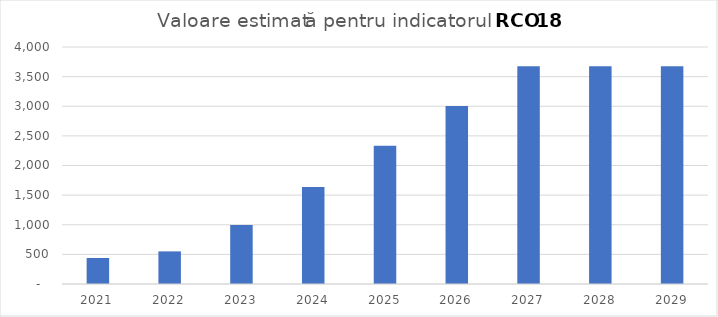
| Category | Series 0 |
|---|---|
| 2021.0 | 438.746 |
| 2022.0 | 550.292 |
| 2023.0 | 996.475 |
| 2024.0 | 1636.004 |
| 2025.0 | 2335.023 |
| 2026.0 | 3004.297 |
| 2027.0 | 3673.572 |
| 2028.0 | 3673.572 |
| 2029.0 | 3673.572 |